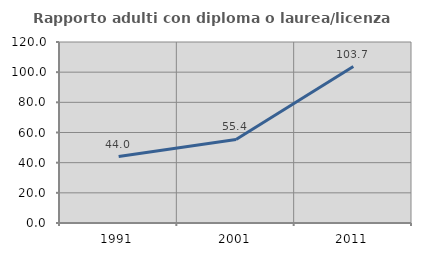
| Category | Rapporto adulti con diploma o laurea/licenza media  |
|---|---|
| 1991.0 | 44.022 |
| 2001.0 | 55.375 |
| 2011.0 | 103.716 |